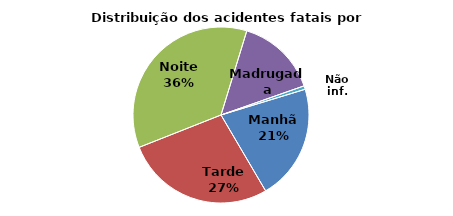
| Category | Series 0 |
|---|---|
| Manhã | 394 |
| Tarde | 509 |
| Noite | 662 |
| Madrugada | 276 |
| Não inf. | 12 |